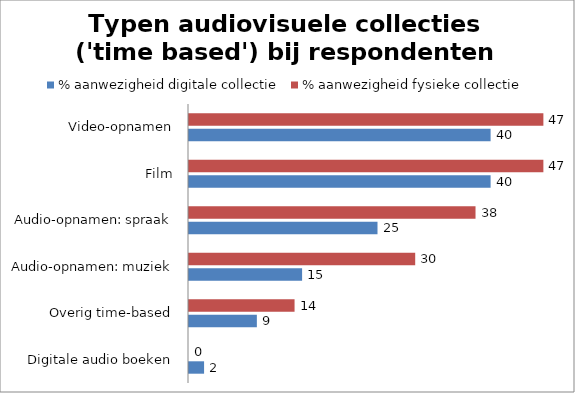
| Category | % aanwezigheid digitale collectie | % aanwezigheid fysieke collectie |
|---|---|---|
| Digitale audio boeken | 2 | 0 |
| Overig time-based | 9 | 14 |
| Audio-opnamen: muziek | 15 | 30 |
| Audio-opnamen: spraak | 25 | 38 |
| Film | 40 | 47 |
| Video-opnamen | 40 | 47 |